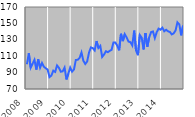
| Category | Series 0 |
|---|---|
| 2008.0 | 100.197 |
| 2.0 | 113.588 |
| 3.0 | 96.096 |
| 4.0 | 100.815 |
| 5.0 | 105.563 |
| 6.0 | 93.649 |
| 7.0 | 106.166 |
| 8.0 | 96.011 |
| 9.0 | 101.755 |
| 10.0 | 97.173 |
| 11.0 | 95.325 |
| 12.0 | 93.662 |
| 2009.0 | 84.558 |
| 2.0 | 86.427 |
| 3.0 | 92.351 |
| 4.0 | 90.807 |
| 5.0 | 98.702 |
| 6.0 | 95.849 |
| 7.0 | 91.051 |
| 8.0 | 91.606 |
| 9.0 | 96.048 |
| 10.0 | 81.666 |
| 11.0 | 88.644 |
| 12.0 | 96.146 |
| 2010.0 | 91.163 |
| 2.0 | 93.89 |
| 3.0 | 105.5 |
| 4.0 | 105.53 |
| 5.0 | 107.966 |
| 6.0 | 114.503 |
| 7.0 | 104.45 |
| 8.0 | 100.528 |
| 9.0 | 103.531 |
| 10.0 | 114.386 |
| 11.0 | 120.705 |
| 12.0 | 119.875 |
| 2011.0 | 117.058 |
| 2.0 | 128.471 |
| 3.0 | 119.993 |
| 4.0 | 122.583 |
| 5.0 | 109.134 |
| 6.0 | 112.036 |
| 7.0 | 116.052 |
| 8.0 | 114.886 |
| 9.0 | 116.492 |
| 10.0 | 117.799 |
| 11.0 | 126.794 |
| 12.0 | 126.765 |
| 2012.0 | 122.89 |
| 2.0 | 117.179 |
| 3.0 | 137.328 |
| 4.0 | 128.414 |
| 5.0 | 136.864 |
| 6.0 | 132.823 |
| 7.0 | 127.841 |
| 8.0 | 127.118 |
| 9.0 | 123.173 |
| 10.0 | 141.197 |
| 11.0 | 116.903 |
| 12.0 | 111.257 |
| 2013.0 | 135.85 |
| 2.0 | 132.585 |
| 3.0 | 118.231 |
| 4.0 | 138.277 |
| 5.0 | 121.542 |
| 6.0 | 133.034 |
| 7.0 | 139.391 |
| 8.0 | 140.15 |
| 9.0 | 132.154 |
| 10.0 | 139.33 |
| 11.0 | 143.644 |
| 12.0 | 142.331 |
| 2014.0 | 144.778 |
| 2.0 | 140.439 |
| 3.0 | 142.249 |
| 4.0 | 140.378 |
| 5.0 | 139.549 |
| 6.0 | 136.56 |
| 7.0 | 137.828 |
| 8.0 | 141.265 |
| 9.0 | 151.285 |
| 10.0 | 148.894 |
| 11.0 | 135.493 |
| 12.0 | 147.284 |